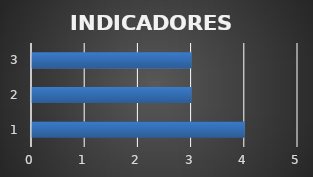
| Category | Series 0 |
|---|---|
| 0 | 4 |
| 1 | 3 |
| 2 | 3 |